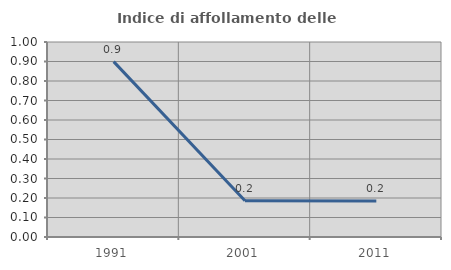
| Category | Indice di affollamento delle abitazioni  |
|---|---|
| 1991.0 | 0.899 |
| 2001.0 | 0.186 |
| 2011.0 | 0.185 |